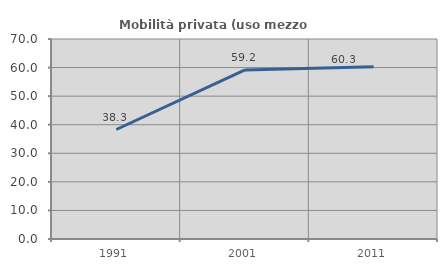
| Category | Mobilità privata (uso mezzo privato) |
|---|---|
| 1991.0 | 38.321 |
| 2001.0 | 59.155 |
| 2011.0 | 60.251 |